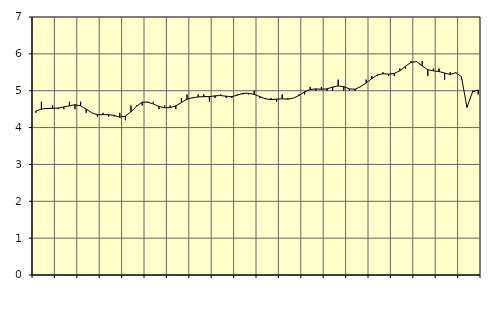
| Category | Piggar | Personliga och kulturella tjänster, SNI 90-98 |
|---|---|---|
| nan | 4.4 | 4.45 |
| 1.0 | 4.7 | 4.5 |
| 1.0 | 4.5 | 4.52 |
| 1.0 | 4.6 | 4.52 |
| nan | 4.5 | 4.53 |
| 2.0 | 4.5 | 4.56 |
| 2.0 | 4.7 | 4.59 |
| 2.0 | 4.5 | 4.62 |
| nan | 4.7 | 4.59 |
| 3.0 | 4.4 | 4.5 |
| 3.0 | 4.4 | 4.4 |
| 3.0 | 4.3 | 4.35 |
| nan | 4.4 | 4.35 |
| 4.0 | 4.3 | 4.35 |
| 4.0 | 4.3 | 4.33 |
| 4.0 | 4.4 | 4.28 |
| nan | 4.2 | 4.31 |
| 5.0 | 4.6 | 4.43 |
| 5.0 | 4.6 | 4.58 |
| 5.0 | 4.6 | 4.69 |
| nan | 4.7 | 4.69 |
| 6.0 | 4.7 | 4.64 |
| 6.0 | 4.5 | 4.57 |
| 6.0 | 4.6 | 4.54 |
| nan | 4.6 | 4.54 |
| 7.0 | 4.5 | 4.59 |
| 7.0 | 4.8 | 4.68 |
| 7.0 | 4.9 | 4.77 |
| nan | 4.8 | 4.81 |
| 8.0 | 4.9 | 4.83 |
| 8.0 | 4.9 | 4.84 |
| 8.0 | 4.7 | 4.84 |
| nan | 4.8 | 4.86 |
| 9.0 | 4.9 | 4.87 |
| 9.0 | 4.8 | 4.85 |
| 9.0 | 4.8 | 4.84 |
| nan | 4.9 | 4.88 |
| 10.0 | 4.9 | 4.93 |
| 10.0 | 4.9 | 4.93 |
| 10.0 | 5 | 4.9 |
| nan | 4.8 | 4.84 |
| 11.0 | 4.8 | 4.78 |
| 11.0 | 4.8 | 4.76 |
| 11.0 | 4.7 | 4.77 |
| nan | 4.9 | 4.78 |
| 12.0 | 4.8 | 4.77 |
| 12.0 | 4.8 | 4.8 |
| 12.0 | 4.9 | 4.87 |
| nan | 4.9 | 4.97 |
| 13.0 | 5.1 | 5.03 |
| 13.0 | 5 | 5.05 |
| 13.0 | 5.1 | 5.04 |
| nan | 5 | 5.05 |
| 14.0 | 5 | 5.1 |
| 14.0 | 5.3 | 5.13 |
| 14.0 | 5 | 5.11 |
| nan | 5 | 5.05 |
| 15.0 | 5 | 5.04 |
| 15.0 | 5.1 | 5.11 |
| 15.0 | 5.3 | 5.21 |
| nan | 5.4 | 5.33 |
| 16.0 | 5.4 | 5.43 |
| 16.0 | 5.5 | 5.46 |
| 16.0 | 5.4 | 5.45 |
| nan | 5.4 | 5.47 |
| 17.0 | 5.6 | 5.54 |
| 17.0 | 5.6 | 5.66 |
| 17.0 | 5.8 | 5.77 |
| nan | 5.8 | 5.79 |
| 18.0 | 5.8 | 5.67 |
| 18.0 | 5.4 | 5.57 |
| 18.0 | 5.6 | 5.54 |
| nan | 5.6 | 5.52 |
| 19.0 | 5.3 | 5.48 |
| 19.0 | 5.5 | 5.44 |
| 19.0 | 5.5 | 5.49 |
| nan | 5.3 | 5.38 |
| 20.0 | 4.6 | 4.55 |
| 20.0 | 5 | 4.97 |
| 20.0 | 4.9 | 5.02 |